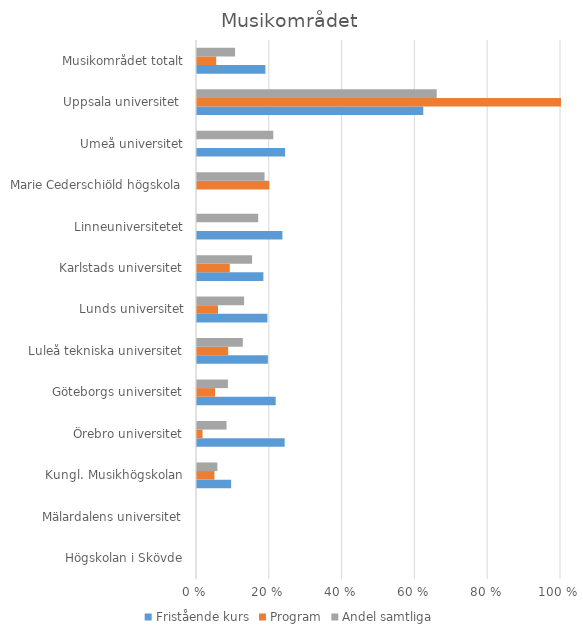
| Category | Fristående kurs | Program | Andel samtliga |
|---|---|---|---|
| Högskolan i Skövde | 0 | 0 | 0 |
| Mälardalens universitet | 0 | 0 | 0 |
| Kungl. Musikhögskolan | 0.094 | 0.048 | 0.056 |
| Örebro universitet | 0.241 | 0.015 | 0.081 |
| Göteborgs universitet | 0.216 | 0.05 | 0.085 |
| Luleå tekniska universitet | 0.195 | 0.086 | 0.126 |
| Lunds universitet | 0.193 | 0.058 | 0.129 |
| Karlstads universitet | 0.182 | 0.09 | 0.151 |
| Linneuniversitetet | 0.235 | 0 | 0.168 |
| Marie Cederschiöld högskola | 0 | 0.199 | 0.186 |
| Umeå universitet | 0.242 | 0 | 0.21 |
| Uppsala universitet  | 0.622 | 1 | 0.659 |
| Musikområdet totalt | 0.188 | 0.053 | 0.105 |